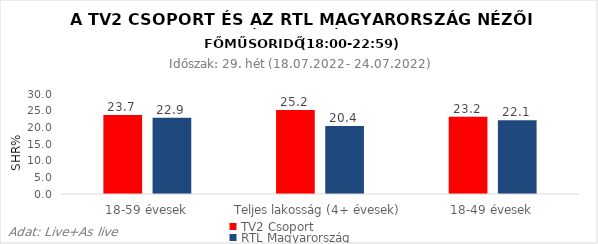
| Category | TV2 Csoport | RTL Magyarország |
|---|---|---|
| 18-59 évesek | 23.7 | 22.9 |
| Teljes lakosság (4+ évesek) | 25.2 | 20.4 |
| 18-49 évesek | 23.2 | 22.1 |